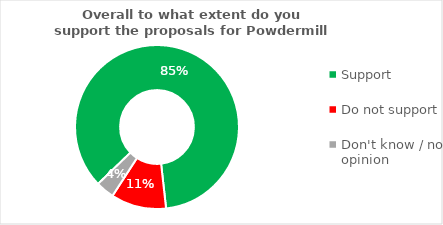
| Category | Series 0 |
|---|---|
| Support | 0.855 |
| Do not support | 0.109 |
| Don't know / no opinion | 0.036 |